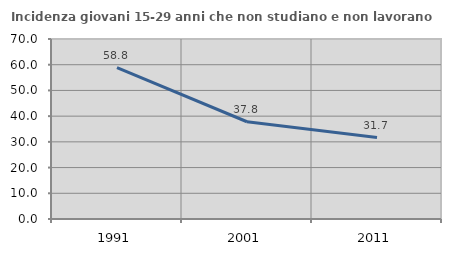
| Category | Incidenza giovani 15-29 anni che non studiano e non lavorano  |
|---|---|
| 1991.0 | 58.824 |
| 2001.0 | 37.817 |
| 2011.0 | 31.652 |